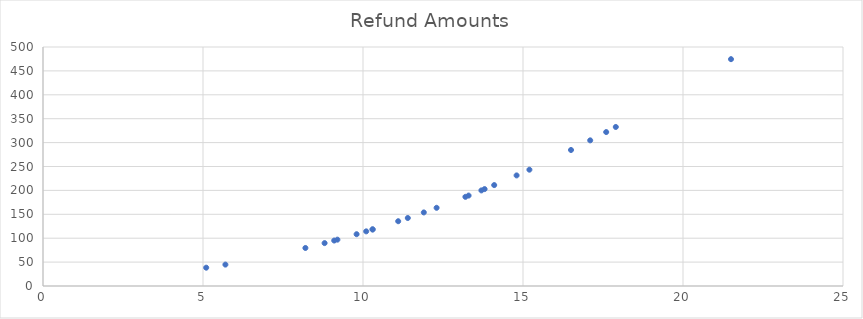
| Category | Refund Amounts |
|---|---|
| 9.8 | 108.34 |
| 8.2 | 79.54 |
| 16.5 | 284.55 |
| 11.4 | 142.26 |
| 17.9 | 332.71 |
| 5.1 | 38.31 |
| 21.5 | 474.55 |
| 10.1 | 114.31 |
| 13.7 | 199.99 |
| 14.1 | 211.11 |
| 17.6 | 322.06 |
| 5.7 | 44.79 |
| 10.3 | 118.39 |
| 11.1 | 135.51 |
| 14.8 | 231.34 |
| 15.2 | 243.34 |
| 9.1 | 95.11 |
| 13.3 | 189.19 |
| 17.1 | 304.71 |
| 13.2 | 186.54 |
| 8.8 | 89.74 |
| 9.2 | 96.94 |
| 11.9 | 153.91 |
| 13.8 | 202.74 |
| 10.3 | 118.39 |
| 12.3 | 163.59 |